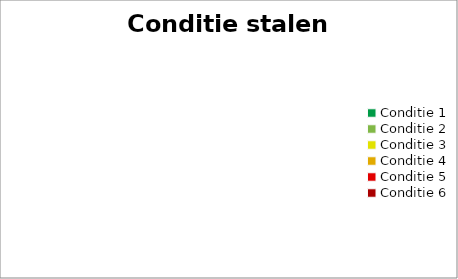
| Category | Conditie stalen dakplaten |
|---|---|
| Conditie 1 | 0 |
| Conditie 2 | 0 |
| Conditie 3 | 0 |
| Conditie 4 | 0 |
| Conditie 5 | 0 |
| Conditie 6 | 0 |